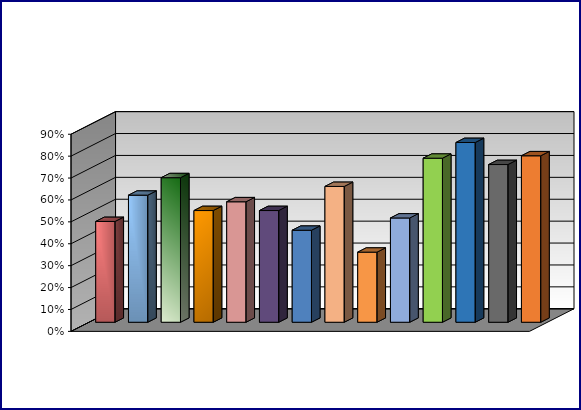
| Category | Series 0 | Series 1 | Series 2 | Series 3 |
|---|---|---|---|---|
| 0 | 0.46 |  |  |  |
| 1 | 0.58 |  |  |  |
| 2 | 0.66 |  |  |  |
| 3 | 0.51 |  |  |  |
| 4 | 0.55 |  |  |  |
| 5 | 0.51 |  |  |  |
| 6 | 0.42 |  |  |  |
| 7 | 0.62 |  |  |  |
| 8 | 0.32 |  |  |  |
| 9 | 0.476 |  |  |  |
| 10 | 0.749 |  |  |  |
| 11 | 0.821 |  |  |  |
| 12 | 0.72 |  |  |  |
| 13 | 0.76 |  |  |  |